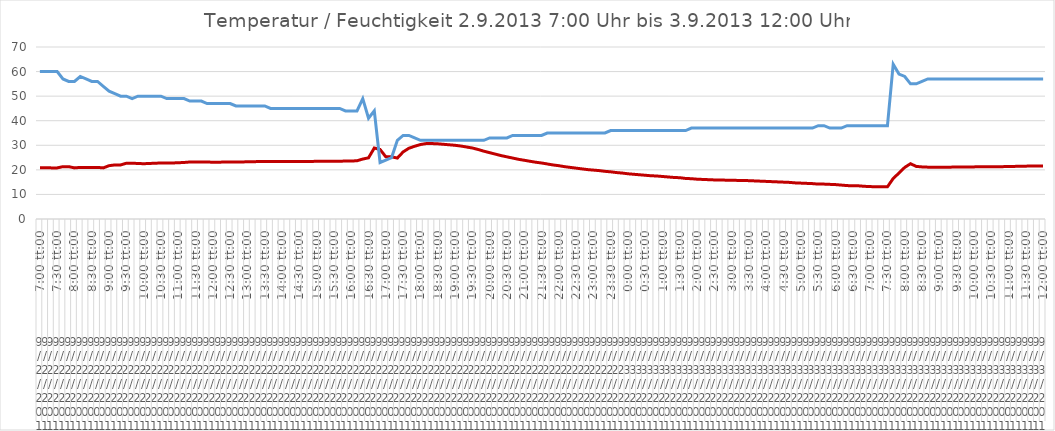
| Category | Series 0 | Series 1 |
|---|---|---|
| 0 | 20.9 | 60 |
| 1 | 20.9 | 60 |
| 2 | 20.8 | 60 |
| 3 | 20.8 | 60 |
| 4 | 21.3 | 57 |
| 5 | 21.3 | 56 |
| 6 | 20.8 | 56 |
| 7 | 21 | 58 |
| 8 | 21 | 57 |
| 9 | 21 | 56 |
| 10 | 21 | 56 |
| 11 | 20.8 | 54 |
| 12 | 21.7 | 52 |
| 13 | 22 | 51 |
| 14 | 22 | 50 |
| 15 | 22.7 | 50 |
| 16 | 22.7 | 49 |
| 17 | 22.6 | 50 |
| 18 | 22.5 | 50 |
| 19 | 22.6 | 50 |
| 20 | 22.7 | 50 |
| 21 | 22.8 | 50 |
| 22 | 22.8 | 49 |
| 23 | 22.8 | 49 |
| 24 | 22.9 | 49 |
| 25 | 23 | 49 |
| 26 | 23.2 | 48 |
| 27 | 23.2 | 48 |
| 28 | 23.2 | 48 |
| 29 | 23.2 | 47 |
| 30 | 23.1 | 47 |
| 31 | 23.1 | 47 |
| 32 | 23.2 | 47 |
| 33 | 23.2 | 47 |
| 34 | 23.2 | 46 |
| 35 | 23.2 | 46 |
| 36 | 23.3 | 46 |
| 37 | 23.3 | 46 |
| 38 | 23.4 | 46 |
| 39 | 23.4 | 46 |
| 40 | 23.4 | 45 |
| 41 | 23.4 | 45 |
| 42 | 23.4 | 45 |
| 43 | 23.4 | 45 |
| 44 | 23.4 | 45 |
| 45 | 23.4 | 45 |
| 46 | 23.4 | 45 |
| 47 | 23.4 | 45 |
| 48 | 23.5 | 45 |
| 49 | 23.5 | 45 |
| 50 | 23.5 | 45 |
| 51 | 23.5 | 45 |
| 52 | 23.5 | 45 |
| 53 | 23.6 | 44 |
| 54 | 23.6 | 44 |
| 55 | 23.7 | 44 |
| 56 | 24.4 | 49 |
| 57 | 24.9 | 41 |
| 58 | 28.9 | 44 |
| 59 | 28.3 | 23 |
| 60 | 25.3 | 24 |
| 61 | 25.3 | 25 |
| 62 | 24.8 | 32 |
| 63 | 27.3 | 34 |
| 64 | 28.8 | 34 |
| 65 | 29.6 | 33 |
| 66 | 30.3 | 32 |
| 67 | 30.7 | 32 |
| 68 | 30.7 | 32 |
| 69 | 30.6 | 32 |
| 70 | 30.4 | 32 |
| 71 | 30.2 | 32 |
| 72 | 30 | 32 |
| 73 | 29.7 | 32 |
| 74 | 29.3 | 32 |
| 75 | 28.9 | 32 |
| 76 | 28.3 | 32 |
| 77 | 27.6 | 32 |
| 78 | 27 | 33 |
| 79 | 26.4 | 33 |
| 80 | 25.8 | 33 |
| 81 | 25.3 | 33 |
| 82 | 24.8 | 34 |
| 83 | 24.3 | 34 |
| 84 | 23.9 | 34 |
| 85 | 23.5 | 34 |
| 86 | 23.1 | 34 |
| 87 | 22.8 | 34 |
| 88 | 22.4 | 35 |
| 89 | 22 | 35 |
| 90 | 21.7 | 35 |
| 91 | 21.3 | 35 |
| 92 | 21 | 35 |
| 93 | 20.7 | 35 |
| 94 | 20.4 | 35 |
| 95 | 20.1 | 35 |
| 96 | 19.9 | 35 |
| 97 | 19.7 | 35 |
| 98 | 19.4 | 35 |
| 99 | 19.2 | 36 |
| 100 | 18.9 | 36 |
| 101 | 18.7 | 36 |
| 102 | 18.4 | 36 |
| 103 | 18.2 | 36 |
| 104 | 18 | 36 |
| 105 | 17.8 | 36 |
| 106 | 17.6 | 36 |
| 107 | 17.5 | 36 |
| 108 | 17.3 | 36 |
| 109 | 17.1 | 36 |
| 110 | 16.9 | 36 |
| 111 | 16.8 | 36 |
| 112 | 16.5 | 36 |
| 113 | 16.4 | 37 |
| 114 | 16.2 | 37 |
| 115 | 16.1 | 37 |
| 116 | 16 | 37 |
| 117 | 15.9 | 37 |
| 118 | 15.9 | 37 |
| 119 | 15.8 | 37 |
| 120 | 15.8 | 37 |
| 121 | 15.7 | 37 |
| 122 | 15.7 | 37 |
| 123 | 15.6 | 37 |
| 124 | 15.5 | 37 |
| 125 | 15.4 | 37 |
| 126 | 15.3 | 37 |
| 127 | 15.2 | 37 |
| 128 | 15.1 | 37 |
| 129 | 15 | 37 |
| 130 | 14.9 | 37 |
| 131 | 14.7 | 37 |
| 132 | 14.6 | 37 |
| 133 | 14.5 | 37 |
| 134 | 14.4 | 37 |
| 135 | 14.2 | 38 |
| 136 | 14.2 | 38 |
| 137 | 14.1 | 37 |
| 138 | 14 | 37 |
| 139 | 13.8 | 37 |
| 140 | 13.6 | 38 |
| 141 | 13.5 | 38 |
| 142 | 13.5 | 38 |
| 143 | 13.3 | 38 |
| 144 | 13.2 | 38 |
| 145 | 13.1 | 38 |
| 146 | 13.1 | 38 |
| 147 | 13.1 | 38 |
| 148 | 16.5 | 63 |
| 149 | 18.7 | 59 |
| 150 | 21 | 58 |
| 151 | 22.5 | 55 |
| 152 | 21.4 | 55 |
| 153 | 21.2 | 56 |
| 154 | 21.1 | 57 |
| 155 | 21.1 | 57 |
| 156 | 21.1 | 57 |
| 157 | 21.1 | 57 |
| 158 | 21.1 | 57 |
| 159 | 21.2 | 57 |
| 160 | 21.2 | 57 |
| 161 | 21.2 | 57 |
| 162 | 21.2 | 57 |
| 163 | 21.3 | 57 |
| 164 | 21.3 | 57 |
| 165 | 21.3 | 57 |
| 166 | 21.3 | 57 |
| 167 | 21.3 | 57 |
| 168 | 21.4 | 57 |
| 169 | 21.4 | 57 |
| 170 | 21.5 | 57 |
| 171 | 21.5 | 57 |
| 172 | 21.6 | 57 |
| 173 | 21.6 | 57 |
| 174 | 21.6 | 57 |